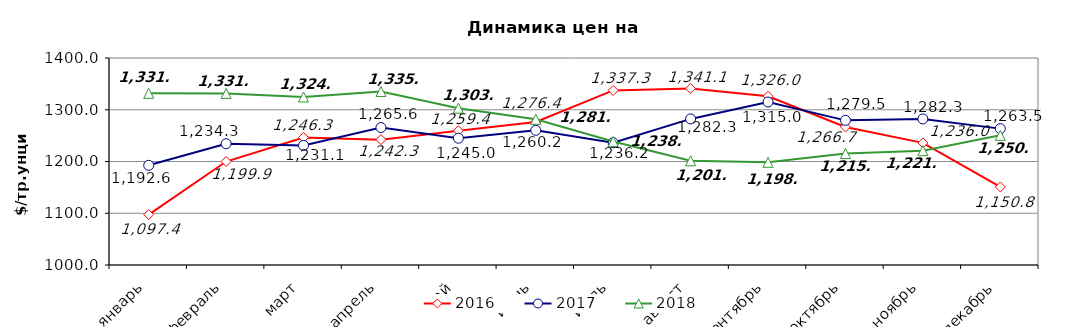
| Category | 2016 | 2017 | 2018 |
|---|---|---|---|
| январь | 1097.38 | 1192.62 | 1331.67 |
| февраль | 1199.91 | 1234.33 | 1331.53 |
| март | 1246.34 | 1231.07 | 1324.66 |
| апрель | 1242.26 | 1265.63 | 1335.34 |
| май | 1259.4 | 1245 | 1303.03 |
| июнь | 1276.4 | 1260.22 | 1281.57 |
| июль | 1337.33 | 1236.22 | 1238.53 |
| август | 1341.09 | 1282.3 | 1201.3 |
| сентябрь | 1326.03 | 1314.98 | 1198.47 |
| октябрь | 1266.71 | 1279.51 | 1215.39 |
| ноябрь | 1235.98 | 1282.28 | 1220.95 |
| декабрь | 1150.77 | 1263.54 | 1250.56 |